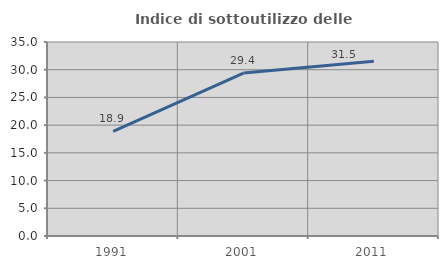
| Category | Indice di sottoutilizzo delle abitazioni  |
|---|---|
| 1991.0 | 18.894 |
| 2001.0 | 29.389 |
| 2011.0 | 31.544 |